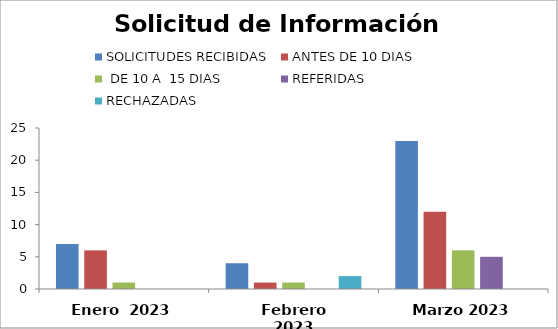
| Category | SOLICITUDES RECIBIDAS | ANTES DE 10 DIAS |  DE 10 A  15 DIAS  | REFERIDAS | RECHAZADAS |
|---|---|---|---|---|---|
| Enero  2023 | 7 | 6 | 1 | 0 | 0 |
| Febrero 2023 | 4 | 1 | 1 | 0 | 2 |
| Marzo 2023 | 23 | 12 | 6 | 5 | 0 |